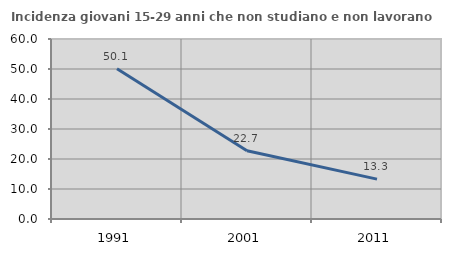
| Category | Incidenza giovani 15-29 anni che non studiano e non lavorano  |
|---|---|
| 1991.0 | 50.08 |
| 2001.0 | 22.727 |
| 2011.0 | 13.281 |